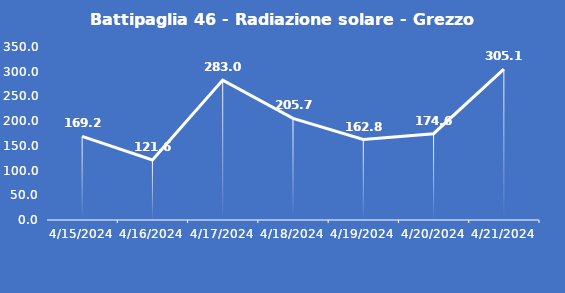
| Category | Battipaglia 46 - Radiazione solare - Grezzo (W/m2) |
|---|---|
| 4/15/24 | 169.2 |
| 4/16/24 | 121.6 |
| 4/17/24 | 283 |
| 4/18/24 | 205.7 |
| 4/19/24 | 162.8 |
| 4/20/24 | 174.6 |
| 4/21/24 | 305.1 |